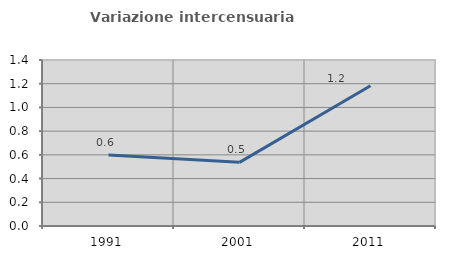
| Category | Variazione intercensuaria annua |
|---|---|
| 1991.0 | 0.6 |
| 2001.0 | 0.537 |
| 2011.0 | 1.183 |